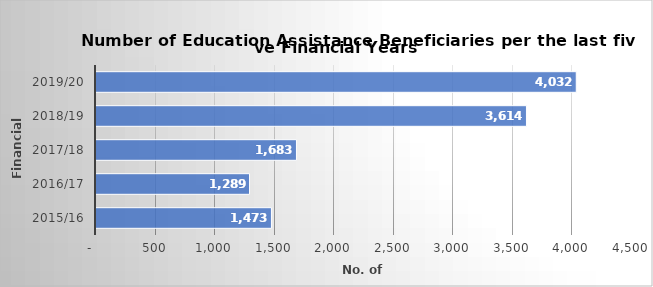
| Category |  GRAND TOTAL  |
|---|---|
| 2015/16 | 1473 |
| 2016/17 | 1289 |
| 2017/18 | 1683 |
| 2018/19 | 3614 |
| 2019/20 | 4032 |